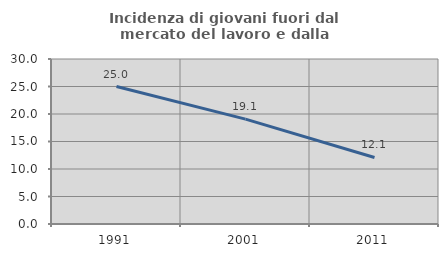
| Category | Incidenza di giovani fuori dal mercato del lavoro e dalla formazione  |
|---|---|
| 1991.0 | 25 |
| 2001.0 | 19.075 |
| 2011.0 | 12.097 |